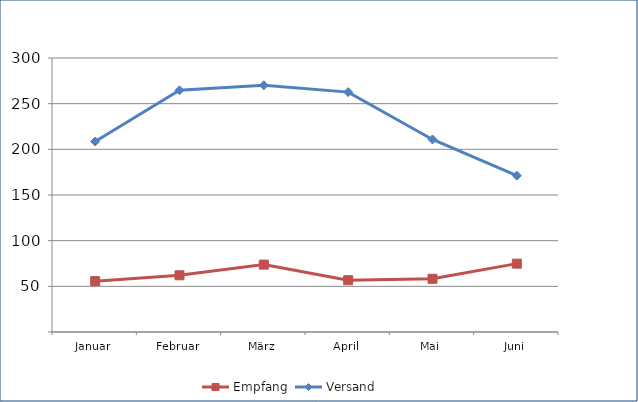
| Category | Empfang | Versand |
|---|---|---|
| Januar | 55.687 | 208.604 |
| Februar | 62.095 | 264.642 |
| März | 73.773 | 270.124 |
| April | 56.711 | 262.668 |
| Mai | 58.26 | 210.77 |
| Juni | 74.862 | 171.182 |